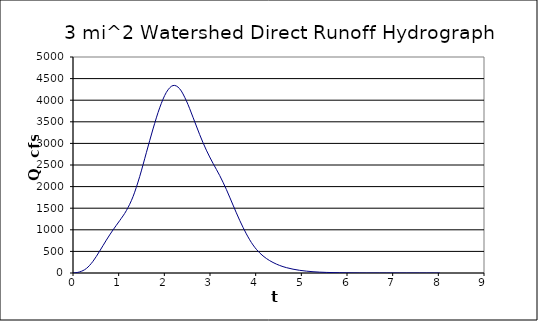
| Category | Series 0 |
|---|---|
| 0.0 | 0 |
| 0.146 | 25.36 |
| 0.292 | 103.975 |
| 0.438 | 271.349 |
| 0.584 | 507.195 |
| 0.73 | 760.792 |
| 0.876 | 996.638 |
| 1.022 | 1211.947 |
| 1.168 | 1443.228 |
| 1.314 | 1766.172 |
| 1.46 | 2231.002 |
| 1.606 | 2784.088 |
| 1.752 | 3334.21 |
| 1.898 | 3823.43 |
| 2.044 | 4180.808 |
| 2.19 | 4339.476 |
| 2.336 | 4264.441 |
| 2.4819999999999998 | 3987.519 |
| 2.628 | 3604.419 |
| 2.774 | 3203.418 |
| 2.92 | 2843.599 |
| 3.066 | 2538.812 |
| 3.212 | 2257.252 |
| 3.3579999999999997 | 1934.573 |
| 3.504 | 1572.88 |
| 3.65 | 1219.201 |
| 3.796 | 905.605 |
| 3.9419999999999997 | 648.898 |
| 4.087999999999999 | 465.025 |
| 4.233999999999998 | 336.31 |
| 4.379999999999997 | 243.433 |
| 4.525999999999996 | 174.359 |
| 4.671999999999995 | 124.663 |
| 4.817999999999994 | 88.51 |
| 4.963999999999993 | 62.165 |
| 5.109999999999992 | 43.087 |
| 5.255999999999991 | 29.311 |
| 5.40199999999999 | 19.716 |
| 5.547999999999989 | 13.462 |
| 5.693999999999988 | 9.255 |
| 5.839999999999987 | 6.17 |
| 5.985999999999986 | 3.702 |
| 6.1319999999999855 | 1.851 |
| 6.2779999999999845 | 0.617 |
| 6.4239999999999835 | 0 |
| 6.5699999999999825 | 0 |
| 6.7159999999999815 | 0 |
| 6.861999999999981 | 0 |
| 7.00799999999998 | 0 |
| 7.153999999999979 | 0 |
| 7.299999999999978 | 0 |
| 7.445999999999977 | 0 |
| 7.591999999999976 | 0 |
| 7.737999999999975 | 0 |
| 7.883999999999974 | 0 |
| 8.029999999999973 | 0 |